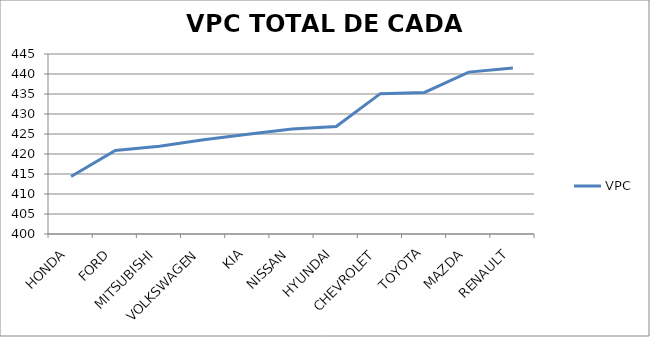
| Category | VPC |
|---|---|
| HONDA | 414.356 |
| FORD | 420.884 |
| MITSUBISHI | 421.918 |
| VOLKSWAGEN | 423.583 |
| KIA | 424.913 |
| NISSAN | 426.275 |
| HYUNDAI | 426.863 |
| CHEVROLET | 435.092 |
| TOYOTA | 435.4 |
| MAZDA | 440.474 |
| RENAULT | 441.483 |